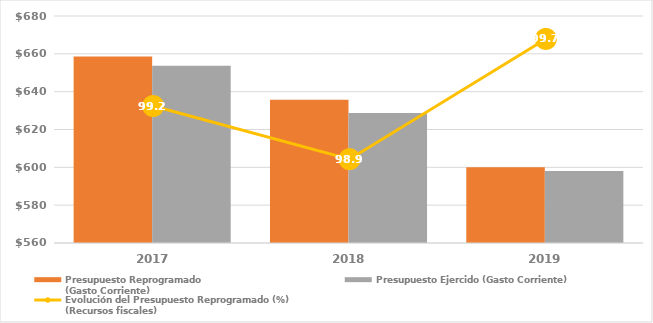
| Category | Presupuesto Reprogramado
(Gasto Corriente) | Presupuesto Ejercido (Gasto Corriente) |
|---|---|---|
| 2017.0 | 658646.191 | 653670.792 |
| 2018.0 | 635662.96 | 628777.639 |
| 2019.0 | 600084.757 | 598036.132 |